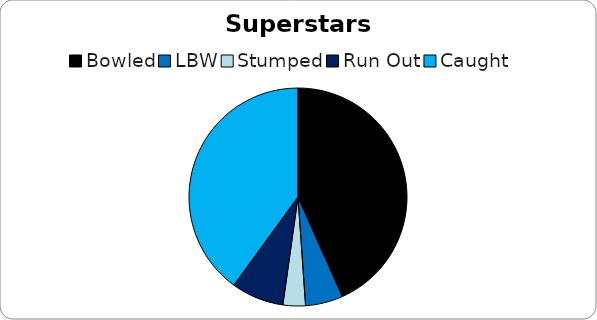
| Category | Superstars bowling |
|---|---|
| Bowled | 39 |
| LBW | 5 |
| Stumped | 3 |
| Run Out | 7 |
| Caught | 36 |